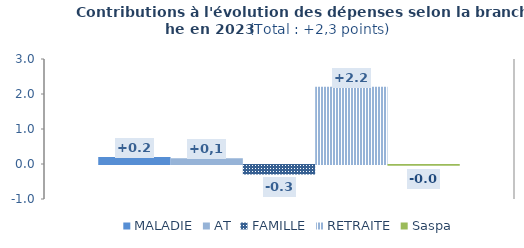
| Category | MALADIE | AT | FAMILLE | RETRAITE | Saspa |
|---|---|---|---|---|---|
| 0 | 0.198 | 0.167 | -0.269 | 2.204 | -0.023 |